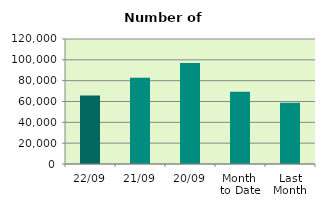
| Category | Series 0 |
|---|---|
| 22/09 | 65698 |
| 21/09 | 82896 |
| 20/09 | 96920 |
| Month 
to Date | 69445.25 |
| Last
Month | 58874.818 |